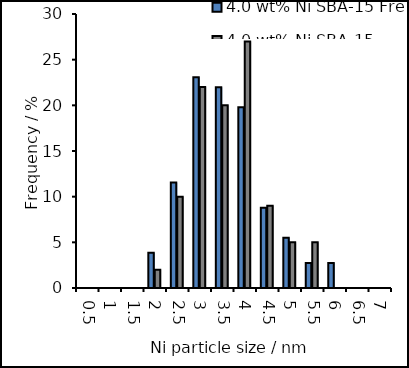
| Category | 4.0 wt% Ni SBA-15 Fresh | 4.0 wt% Ni SBA-15 Spent |
|---|---|---|
| 0.5 | 0 | 0 |
| 1.0 | 0 | 0 |
| 1.5 | 0 | 0 |
| 2.0 | 3.846 | 2 |
| 2.5 | 11.538 | 10 |
| 3.0 | 23.077 | 22 |
| 3.5 | 21.978 | 20 |
| 4.0 | 19.78 | 27 |
| 4.5 | 8.791 | 9 |
| 5.0 | 5.495 | 5 |
| 5.5 | 2.747 | 5 |
| 6.0 | 2.747 | 0 |
| 6.5 | 0 | 0 |
| 7.0 | 0 | 0 |